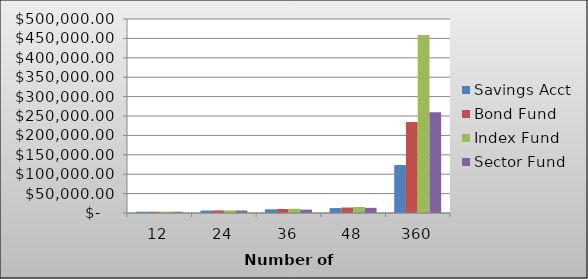
| Category | Savings Acct | Bond Fund | Index Fund | Sector Fund |
|---|---|---|---|---|
| 12.0 | 3270.39 | 3385.88 | 3374.882 | 3295.518 |
| 24.0 | 6340.496 | 6669.879 | 6830.801 | 6417.22 |
| 36.0 | 9476.529 | 10385.981 | 10862.251 | 8788.82 |
| 48.0 | 12695.46 | 14103.137 | 15396.632 | 13311.907 |
| 360.0 | 123539.834 | 234293.473 | 459036.382 | 259526.842 |